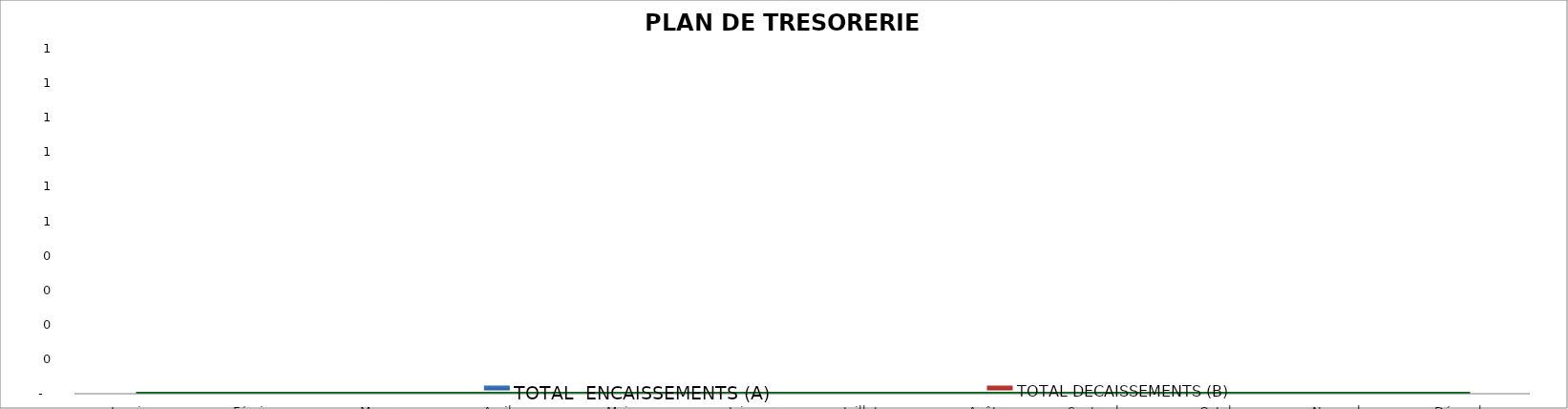
| Category | TOTAL  ENCAISSEMENTS (A) | TOTAL DECAISSEMENTS (B) |
|---|---|---|
| Janvier | 0 | 0 |
| Février | 0 | 0 |
| Mars | 0 | 0 |
| Avril | 0 | 0 |
| Mai | 0 | 0 |
| Juin | 0 | 0 |
| Juillet | 0 | 0 |
| Août | 0 | 0 |
| Septembre | 0 | 0 |
| Octobre | 0 | 0 |
| Novembre | 0 | 0 |
| Décembre | 0 | 0 |